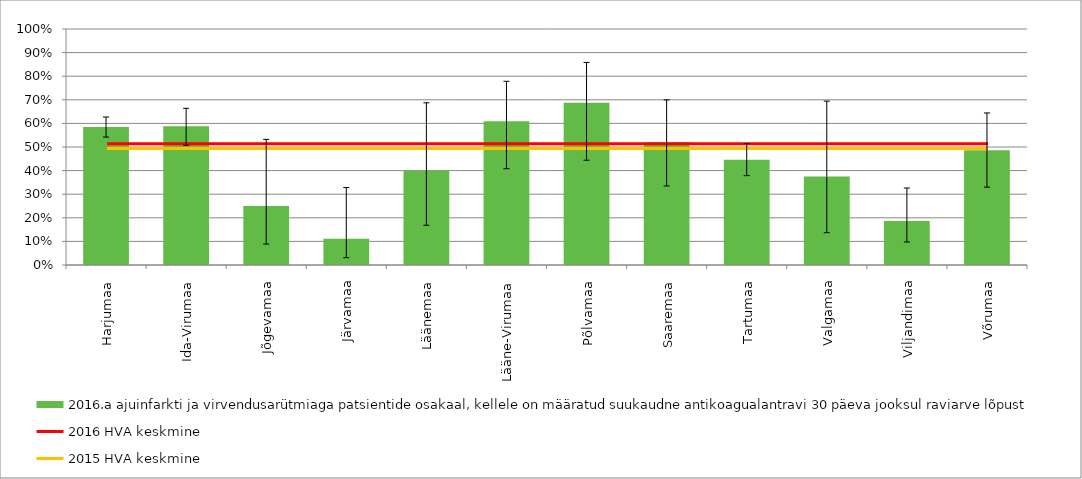
| Category | 2016.a ajuinfarkti ja virvendusarütmiaga patsientide osakaal, kellele on määratud suukaudne antikoagualantravi 30 päeva jooksul raviarve lõpust |
|---|---|
| Harjumaa | 0.585 |
| Ida-Virumaa | 0.588 |
| Jõgevamaa | 0.25 |
| Järvamaa | 0.111 |
| Läänemaa | 0.4 |
| Lääne-Virumaa | 0.609 |
| Põlvamaa | 0.688 |
| Saaremaa | 0.52 |
| Tartumaa | 0.446 |
| Valgamaa | 0.375 |
| Viljandimaa | 0.186 |
| Võrumaa | 0.486 |